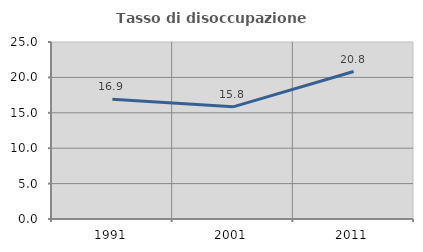
| Category | Tasso di disoccupazione giovanile  |
|---|---|
| 1991.0 | 16.923 |
| 2001.0 | 15.842 |
| 2011.0 | 20.833 |